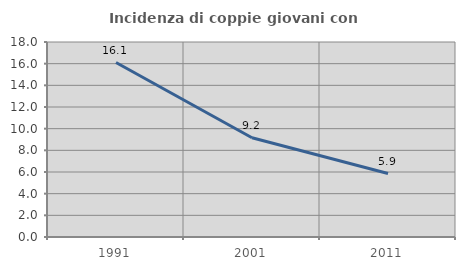
| Category | Incidenza di coppie giovani con figli |
|---|---|
| 1991.0 | 16.105 |
| 2001.0 | 9.16 |
| 2011.0 | 5.859 |